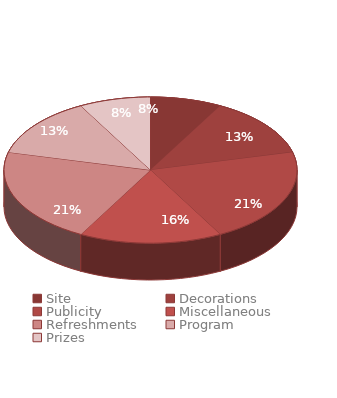
| Category |  £3,800  |
|---|---|
| Site | 300 |
| Decorations | 500 |
| Publicity | 800 |
| Miscellaneous | 600 |
| Refreshments | 800 |
| Program | 500 |
| Prizes | 300 |